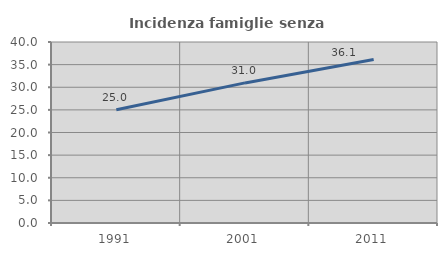
| Category | Incidenza famiglie senza nuclei |
|---|---|
| 1991.0 | 25.02 |
| 2001.0 | 30.961 |
| 2011.0 | 36.136 |